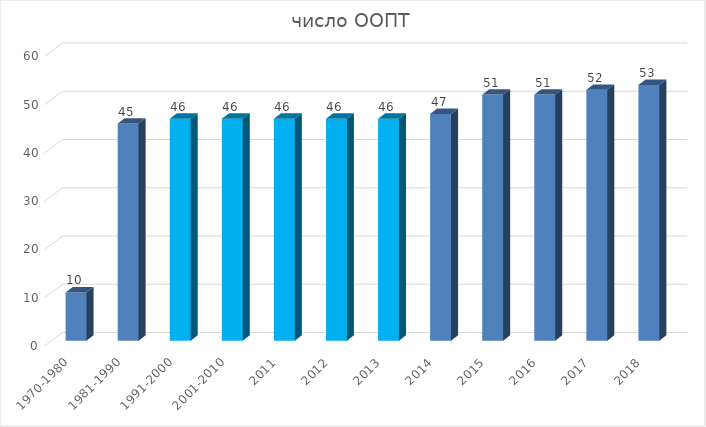
| Category | число ООПТ |
|---|---|
| 1970-1980 | 10 |
| 1981-1990 | 45 |
| 1991-2000 | 46 |
| 2001-2010 | 46 |
| 2011 | 46 |
| 2012 | 46 |
| 2013 | 46 |
| 2014 | 47 |
| 2015 | 51 |
| 2016 | 51 |
| 2017 | 52 |
| 2018 | 53 |